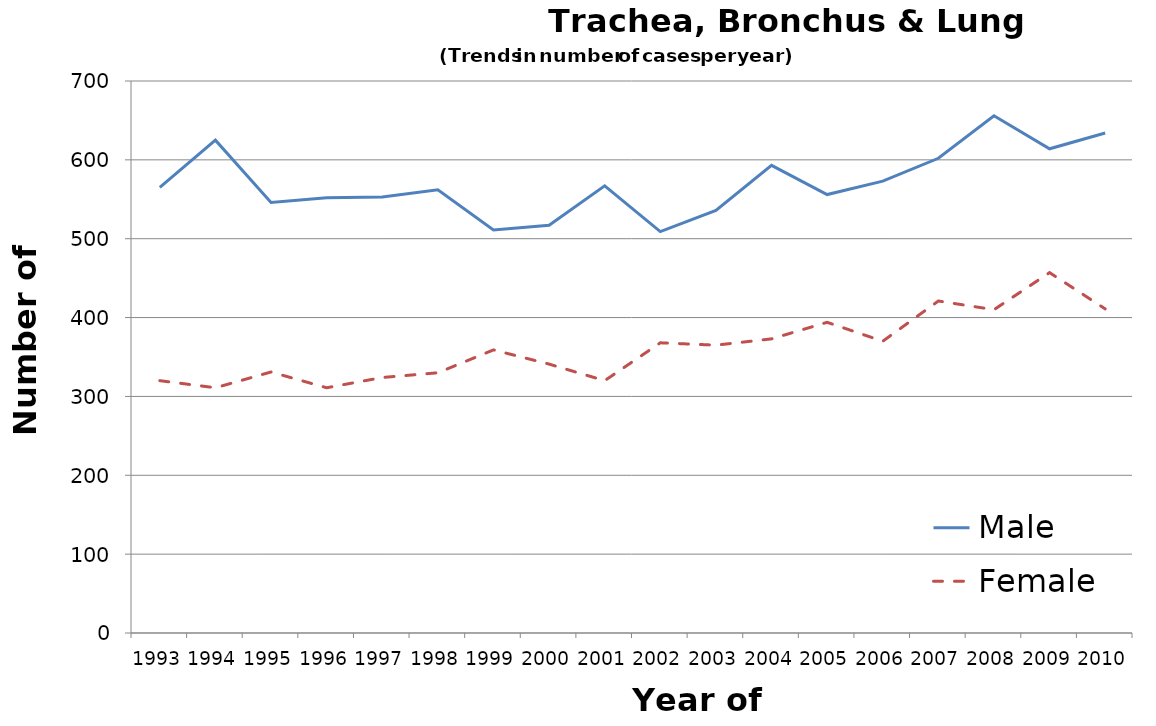
| Category | Male | Female |
|---|---|---|
| 1993.0 | 565 | 320 |
| 1994.0 | 625 | 311 |
| 1995.0 | 546 | 331 |
| 1996.0 | 552 | 311 |
| 1997.0 | 553 | 324 |
| 1998.0 | 562 | 330 |
| 1999.0 | 511 | 359 |
| 2000.0 | 517 | 341 |
| 2001.0 | 567 | 320 |
| 2002.0 | 509 | 368 |
| 2003.0 | 536 | 365 |
| 2004.0 | 593 | 373 |
| 2005.0 | 556 | 394 |
| 2006.0 | 573 | 370 |
| 2007.0 | 602 | 421 |
| 2008.0 | 656 | 410 |
| 2009.0 | 614 | 457 |
| 2010.0 | 634 | 411 |